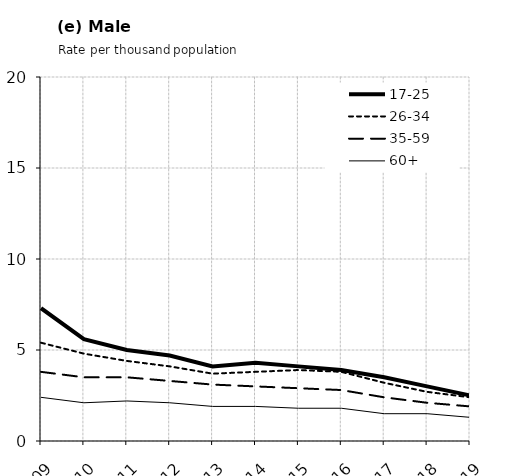
| Category | 17-25 | 26-34 | 35-59 | 60+ |
|---|---|---|---|---|
| 2009.0 | 7.3 | 5.4 | 3.8 | 2.4 |
| 2010.0 | 5.6 | 4.8 | 3.5 | 2.1 |
| 2011.0 | 5 | 4.4 | 3.5 | 2.2 |
| 2012.0 | 4.7 | 4.1 | 3.3 | 2.1 |
| 2013.0 | 4.1 | 3.7 | 3.1 | 1.9 |
| 2014.0 | 4.3 | 3.8 | 3 | 1.9 |
| 2015.0 | 4.1 | 3.9 | 2.9 | 1.8 |
| 2016.0 | 3.9 | 3.8 | 2.8 | 1.8 |
| 2017.0 | 3.5 | 3.2 | 2.4 | 1.5 |
| 2018.0 | 3 | 2.7 | 2.1 | 1.5 |
| 2019.0 | 2.5 | 2.4 | 1.9 | 1.3 |